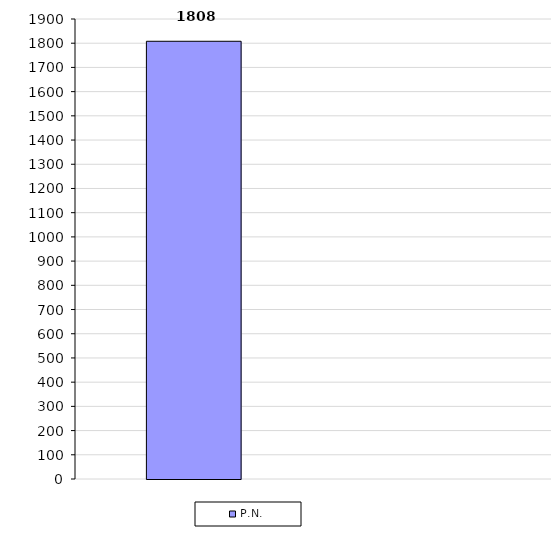
| Category | P.N. | INACIF |
|---|---|---|
| INACIF | 1808 |  |